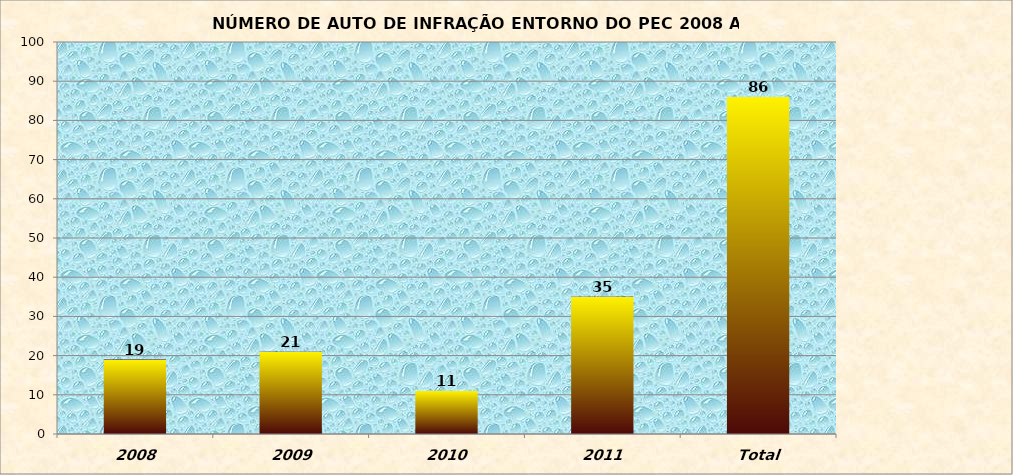
| Category | LAGOS FISCALIZADO |
|---|---|
| 2008 | 19 |
| 2009 | 21 |
| 2010 | 11 |
| 2011 | 35 |
| Total | 86 |